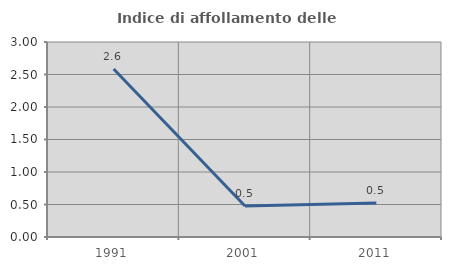
| Category | Indice di affollamento delle abitazioni  |
|---|---|
| 1991.0 | 2.584 |
| 2001.0 | 0.477 |
| 2011.0 | 0.524 |